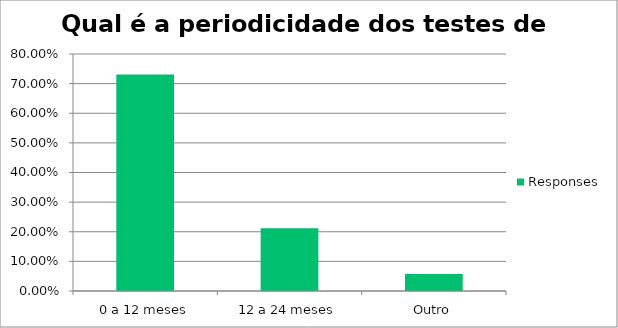
| Category | Responses |
|---|---|
| 0 a 12 meses | 0.731 |
| 12 a 24 meses | 0.212 |
| Outro | 0.058 |